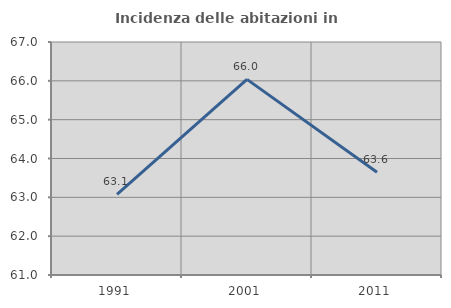
| Category | Incidenza delle abitazioni in proprietà  |
|---|---|
| 1991.0 | 63.074 |
| 2001.0 | 66.037 |
| 2011.0 | 63.648 |